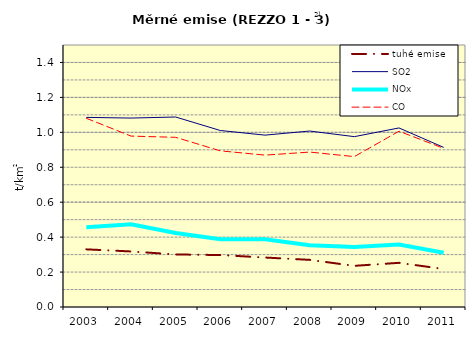
| Category | tuhé emise | SO2 | NOx | CO |
|---|---|---|---|---|
| 2003.0 | 0.33 | 1.086 | 0.456 | 1.081 |
| 2004.0 | 0.318 | 1.082 | 0.474 | 0.978 |
| 2005.0 | 0.301 | 1.088 | 0.424 | 0.971 |
| 2006.0 | 0.297 | 1.01 | 0.388 | 0.894 |
| 2007.0 | 0.283 | 0.984 | 0.388 | 0.87 |
| 2008.0 | 0.27 | 1.007 | 0.353 | 0.887 |
| 2009.0 | 0.236 | 0.975 | 0.344 | 0.861 |
| 2010.0 | 0.253 | 1.025 | 0.357 | 1.006 |
| 2011.0 | 0.218 | 0.914 | 0.31 | 0.908 |